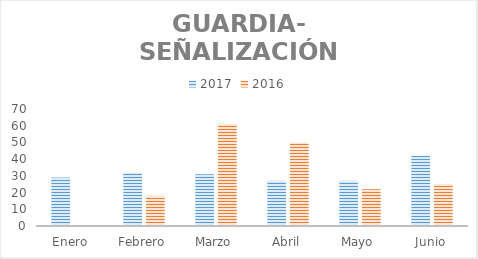
| Category | 2017 | 2016 |
|---|---|---|
| Enero | 29 | 0 |
| Febrero | 32 | 18 |
| Marzo | 31 | 61 |
| Abril | 27 | 50 |
| Mayo | 27 | 22 |
| Junio | 42 | 25 |